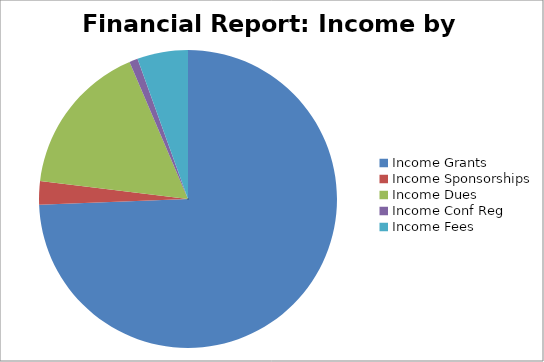
| Category | Series 0 | Series 1 |
|---|---|---|
| 0 | 117402 |  |
| 1 | 4000 |  |
| 2 | 26300 |  |
| 3 | 1450 |  |
| 4 | 8680 |  |